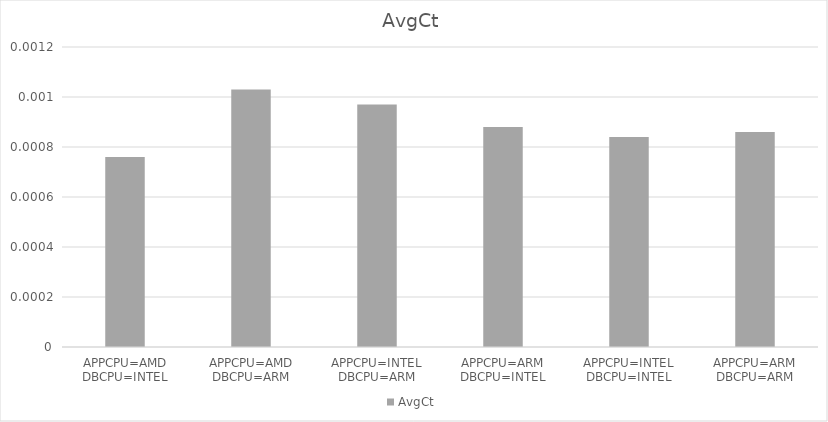
| Category | AvgCt |
|---|---|
| APPCPU=AMD DBCPU=INTEL | 0.001 |
| APPCPU=AMD DBCPU=ARM | 0.001 |
| APPCPU=INTEL DBCPU=ARM | 0.001 |
| APPCPU=ARM DBCPU=INTEL | 0.001 |
| APPCPU=INTEL DBCPU=INTEL | 0.001 |
| APPCPU=ARM DBCPU=ARM | 0.001 |